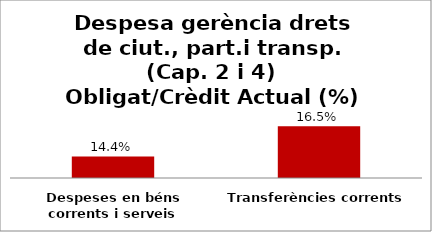
| Category | Series 0 |
|---|---|
| Despeses en béns corrents i serveis | 0.144 |
| Transferències corrents | 0.165 |